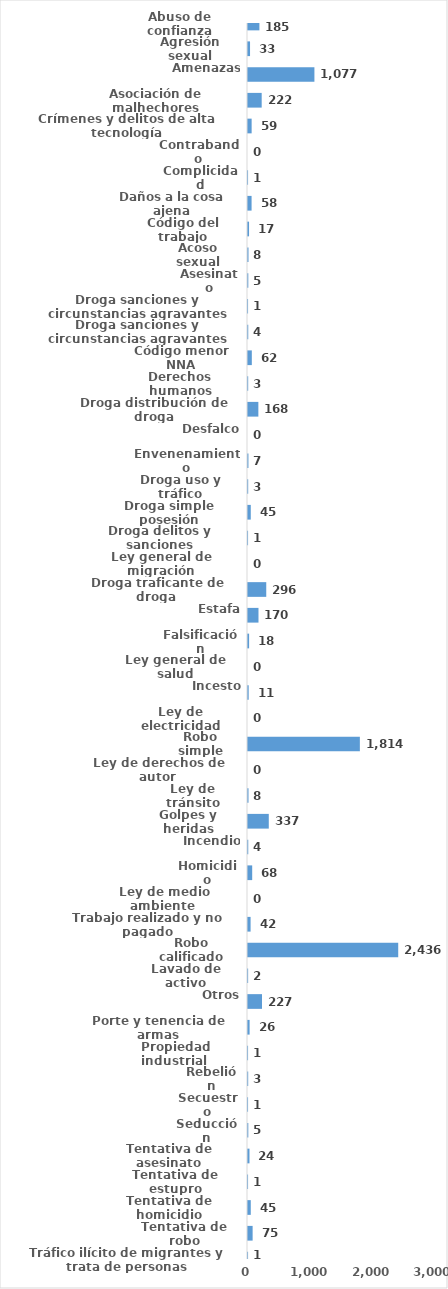
| Category | Series 0 |
|---|---|
| Abuso de confianza | 185 |
| Agresión sexual | 33 |
| Amenazas | 1077 |
| Asociación de malhechores | 222 |
| Crímenes y delitos de alta tecnología | 59 |
| Contrabando | 0 |
| Complicidad | 1 |
| Daños a la cosa ajena | 58 |
| Código del trabajo | 17 |
| Acoso sexual | 8 |
| Asesinato | 5 |
| Droga sanciones y circunstancias agravantes | 1 |
| Droga sanciones y circunstancias agravantes | 4 |
| Código menor NNA | 62 |
| Derechos humanos | 3 |
| Droga distribución de droga | 168 |
| Desfalco | 0 |
| Envenenamiento | 7 |
| Droga uso y tráfico | 3 |
| Droga simple posesión | 45 |
| Droga delitos y sanciones | 1 |
| Ley general de migración | 0 |
| Droga traficante de droga  | 296 |
| Estafa | 170 |
| Falsificación | 18 |
| Ley general de salud | 0 |
| Incesto | 11 |
| Ley de electricidad | 0 |
| Robo simple | 1814 |
| Ley de derechos de autor  | 0 |
| Ley de tránsito | 8 |
| Golpes y heridas | 337 |
| Incendio | 4 |
| Homicidio | 68 |
| Ley de medio ambiente  | 0 |
| Trabajo realizado y no pagado | 42 |
| Robo calificado | 2436 |
| Lavado de activo | 2 |
| Otros | 227 |
| Porte y tenencia de armas | 26 |
| Propiedad industrial  | 1 |
| Rebelión | 3 |
| Secuestro | 1 |
| Seducción | 5 |
| Tentativa de asesinato | 24 |
| Tentativa de estupro | 1 |
| Tentativa de homicidio | 45 |
| Tentativa de robo | 75 |
| Tráfico ilícito de migrantes y trata de personas | 1 |